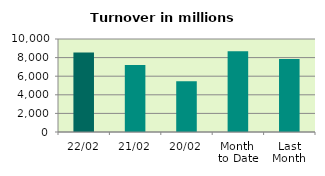
| Category | Series 0 |
|---|---|
| 22/02 | 8560.963 |
| 21/02 | 7215.081 |
| 20/02 | 5450.215 |
| Month 
to Date | 8688.919 |
| Last
Month | 7855.802 |